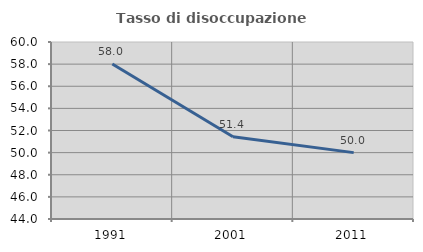
| Category | Tasso di disoccupazione giovanile  |
|---|---|
| 1991.0 | 58.011 |
| 2001.0 | 51.429 |
| 2011.0 | 50 |